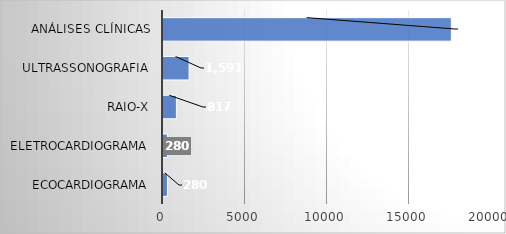
| Category | Series 0 |
|---|---|
| ECOCARDIOGRAMA | 280 |
| ELETROCARDIOGRAMA | 280 |
| RAIO-X | 817 |
| ULTRASSONOGRAFIA | 1591 |
| ANÁLISES CLÍNICAS | 17582 |